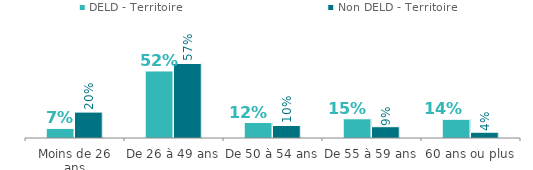
| Category | DELD - Territoire | Non DELD - Territoire |
|---|---|---|
| Moins de 26 ans | 0.074 | 0.199 |
| De 26 à 49 ans | 0.516 | 0.573 |
| De 50 à 54 ans | 0.119 | 0.096 |
| De 55 à 59 ans | 0.148 | 0.087 |
| 60 ans ou plus | 0.144 | 0.044 |